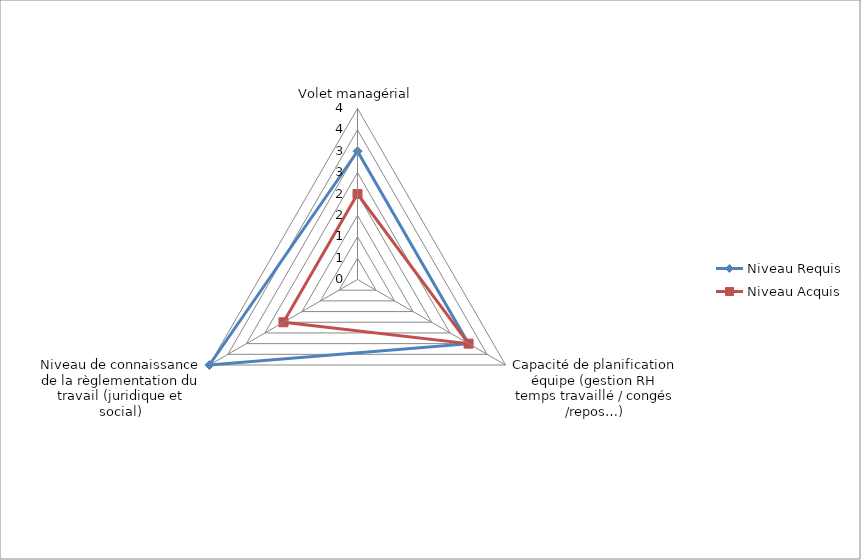
| Category | Niveau Requis | Niveau Acquis |
|---|---|---|
| Volet managérial | 3 | 2 |
| Capacité de planification équipe (gestion RH temps travaillé / congés /repos…) | 3 | 3 |
| Niveau de connaissance de la règlementation du travail (juridique et social) | 4 | 2 |